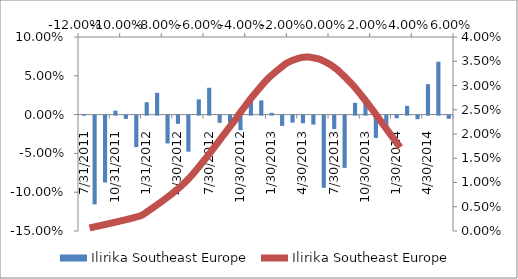
| Category | Ilirika Southeast Europe |
|---|---|
| 31/07/2011 | 0 |
| 31/08/2011 | -0.114 |
| 30/09/2011 | -0.086 |
| 31/10/2011 | 0.005 |
| 30/11/2011 | -0.004 |
| 31/12/2011 | -0.041 |
| 31/01/2012 | 0.016 |
| 29/02/2012 | 0.028 |
| 31/03/2012 | -0.036 |
| 30/04/2012 | -0.011 |
| 31/05/2012 | -0.047 |
| 30/06/2012 | 0.02 |
| 31/07/2012 | 0.035 |
| 31/08/2012 | -0.009 |
| 30/09/2012 | -0.009 |
| 31/10/2012 | -0.019 |
| 30/11/2012 | 0.022 |
| 31/12/2012 | 0.018 |
| 31/01/2013 | 0.002 |
| 28/02/2013 | -0.013 |
| 31/03/2013 | -0.009 |
| 30/04/2013 | -0.01 |
| 31/05/2013 | -0.012 |
| 30/06/2013 | -0.093 |
| 31/07/2013 | -0.017 |
| 31/08/2013 | -0.067 |
| 30/09/2013 | 0.015 |
| 31/10/2013 | 0.023 |
| 30/11/2013 | -0.029 |
| 31/12/2013 | -0.021 |
| 31/01/2014 | -0.003 |
| 28/02/2014 | 0.011 |
| 31/03/2014 | -0.005 |
| 30/04/2014 | 0.039 |
| 31/05/2014 | 0.068 |
| 30/06/2014 | -0.004 |